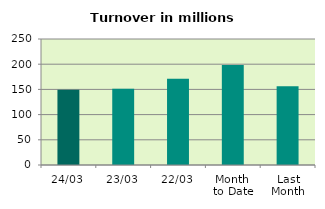
| Category | Series 0 |
|---|---|
| 24/03 | 149.066 |
| 23/03 | 151.051 |
| 22/03 | 171.068 |
| Month 
to Date | 198.468 |
| Last
Month | 156.222 |